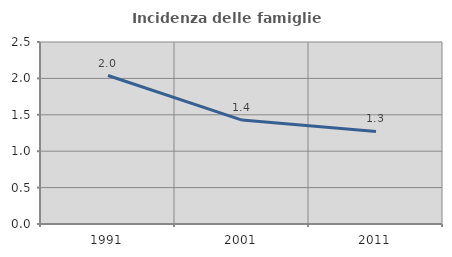
| Category | Incidenza delle famiglie numerose |
|---|---|
| 1991.0 | 2.04 |
| 2001.0 | 1.427 |
| 2011.0 | 1.271 |